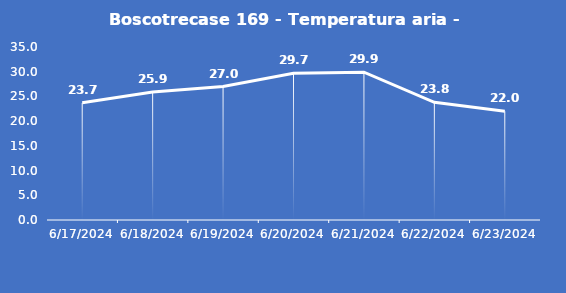
| Category | Boscotrecase 169 - Temperatura aria - Grezzo (°C) |
|---|---|
| 6/17/24 | 23.7 |
| 6/18/24 | 25.9 |
| 6/19/24 | 27 |
| 6/20/24 | 29.7 |
| 6/21/24 | 29.9 |
| 6/22/24 | 23.8 |
| 6/23/24 | 22 |